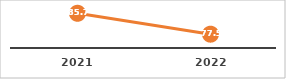
| Category | INSERCIÓN LABORAL POR BOLSA DE TRABAJO (%) |
|---|---|
| 2021.0 | 85.708 |
| 2022.0 | 77.454 |